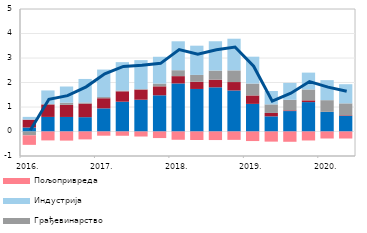
| Category | Остале делатности | Трговина | Грађевинарство | Индустрија | Пољопривреда |
|---|---|---|---|---|---|
| 2016. | 0.163 | 0.321 | -0.156 | 0.113 | -0.39 |
| II | 0.595 | 0.508 | 0.015 | 0.558 | -0.363 |
| III | 0.594 | 0.494 | 0.088 | 0.66 | -0.372 |
| IV | 0.585 | 0.553 | 0.046 | 0.96 | -0.322 |
| 2017. | 0.945 | 0.413 | 0.049 | 1.121 | -0.172 |
| II | 1.216 | 0.424 | 0.032 | 1.158 | -0.174 |
| III | 1.297 | 0.414 | 0.02 | 1.182 | -0.205 |
| IV | 1.478 | 0.366 | 0.113 | 1.094 | -0.268 |
| 2018. | 1.962 | 0.298 | 0.242 | 1.18 | -0.338 |
| II | 1.736 | 0.292 | 0.281 | 1.193 | -0.346 |
| III | 1.803 | 0.311 | 0.372 | 1.197 | -0.349 |
| IV | 1.675 | 0.344 | 0.476 | 1.293 | -0.341 |
| 2019. | 1.127 | 0.345 | 0.485 | 1.097 | -0.39 |
| II | 0.619 | 0.139 | 0.349 | 0.547 | -0.413 |
| III | 0.834 | 0.029 | 0.43 | 0.691 | -0.42 |
| IV | 1.2 | 0.072 | 0.444 | 0.687 | -0.366 |
| 2020. | 0.799 | 0.004 | 0.477 | 0.817 | -0.286 |
| II | 0.64 | 0.023 | 0.486 | 0.781 | -0.286 |